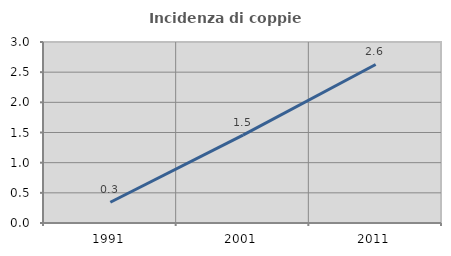
| Category | Incidenza di coppie miste |
|---|---|
| 1991.0 | 0.344 |
| 2001.0 | 1.456 |
| 2011.0 | 2.628 |